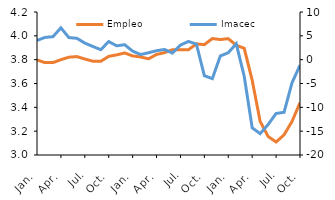
| Category | Empleo |
|---|---|
| 2018-01-01 | 3.798 |
| 2018-02-01 | 3.775 |
| 2018-03-01 | 3.775 |
| 2018-04-01 | 3.8 |
| 2018-05-01 | 3.821 |
| 2018-06-01 | 3.826 |
| 2018-07-01 | 3.805 |
| 2018-08-01 | 3.787 |
| 2018-09-01 | 3.786 |
| 2018-10-01 | 3.828 |
| 2018-11-01 | 3.84 |
| 2018-12-01 | 3.856 |
| 2019-01-01 | 3.831 |
| 2019-02-01 | 3.823 |
| 2019-03-01 | 3.807 |
| 2019-04-01 | 3.844 |
| 2019-05-01 | 3.859 |
| 2019-06-01 | 3.884 |
| 2019-07-01 | 3.882 |
| 2019-08-01 | 3.883 |
| 2019-09-01 | 3.933 |
| 2019-10-01 | 3.926 |
| 2019-11-01 | 3.977 |
| 2019-12-01 | 3.969 |
| 2020-01-01 | 3.976 |
| 2020-02-01 | 3.921 |
| 2020-03-01 | 3.895 |
| 2020-04-01 | 3.628 |
| 2020-05-01 | 3.282 |
| 2020-06-01 | 3.155 |
| 2020-07-01 | 3.109 |
| 2020-08-01 | 3.169 |
| 2020-09-01 | 3.282 |
| 2020-10-01 | 3.438 |